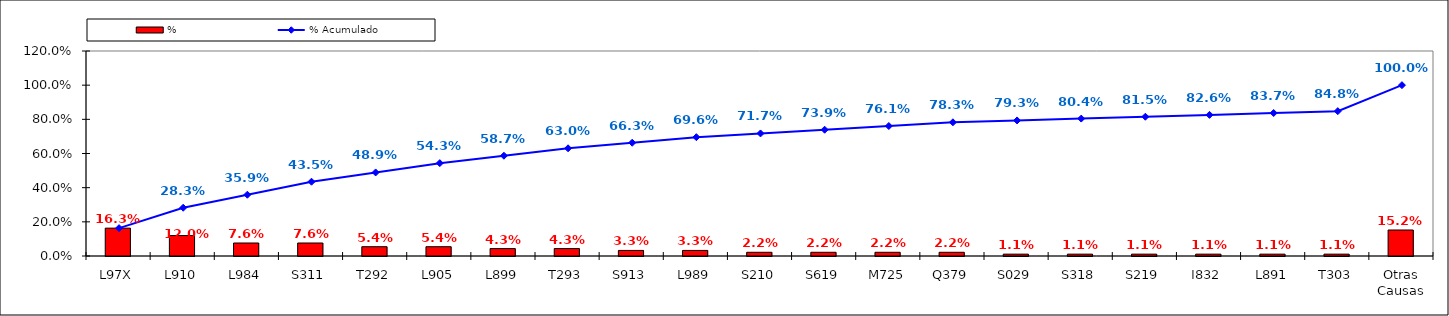
| Category | % |
|---|---|
| L97X | 0.163 |
| L910 | 0.12 |
| L984 | 0.076 |
| S311 | 0.076 |
| T292 | 0.054 |
| L905 | 0.054 |
| L899 | 0.043 |
| T293 | 0.043 |
| S913 | 0.033 |
| L989 | 0.033 |
| S210 | 0.022 |
| S619 | 0.022 |
| M725 | 0.022 |
| Q379 | 0.022 |
| S029 | 0.011 |
| S318 | 0.011 |
| S219 | 0.011 |
| I832 | 0.011 |
| L891 | 0.011 |
| T303 | 0.011 |
| Otras Causas | 0.152 |